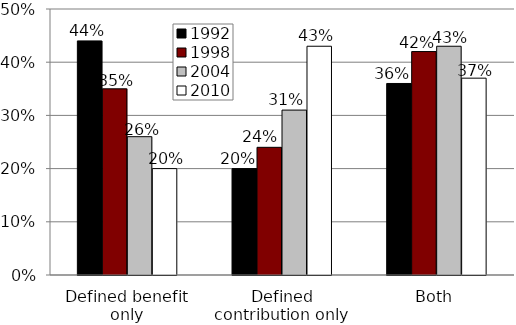
| Category | 1992 | 1998 | 2004 | 2010 |
|---|---|---|---|---|
| Defined benefit only | 0.44 | 0.35 | 0.26 | 0.2 |
| Defined contribution only | 0.2 | 0.24 | 0.31 | 0.43 |
| Both | 0.36 | 0.42 | 0.43 | 0.37 |